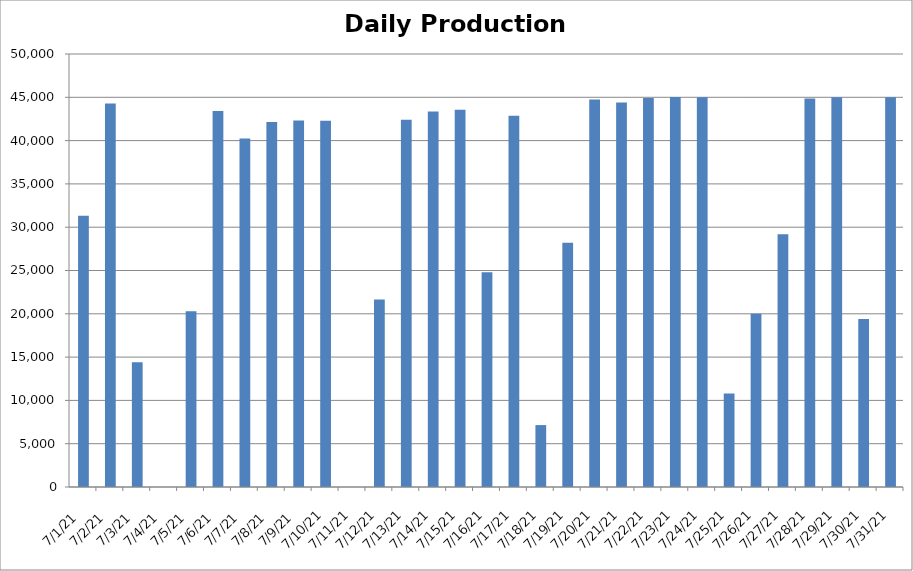
| Category | Cogen Daily Production (kWh) |
|---|---|
| 7/1/21 | 31309.75 |
| 7/2/21 | 44282.75 |
| 7/3/21 | 14396.75 |
| 7/4/21 | 0 |
| 7/5/21 | 20308.5 |
| 7/6/21 | 43408.25 |
| 7/7/21 | 40232.5 |
| 7/8/21 | 42136.5 |
| 7/9/21 | 42317.25 |
| 7/10/21 | 42291.5 |
| 7/11/21 | 0 |
| 7/12/21 | 21643 |
| 7/13/21 | 42407.25 |
| 7/14/21 | 43365.5 |
| 7/15/21 | 43576.75 |
| 7/16/21 | 24803.5 |
| 7/17/21 | 42868 |
| 7/18/21 | 7150 |
| 7/19/21 | 28206.25 |
| 7/20/21 | 44748.75 |
| 7/21/21 | 44397 |
| 7/22/21 | 44928.75 |
| 7/23/21 | 45039 |
| 7/24/21 | 44997.5 |
| 7/25/21 | 10789.5 |
| 7/26/21 | 20016.25 |
| 7/27/21 | 29179 |
| 7/28/21 | 44874 |
| 7/29/21 | 44992.75 |
| 7/30/21 | 19386 |
| 7/31/21 | 45011.75 |